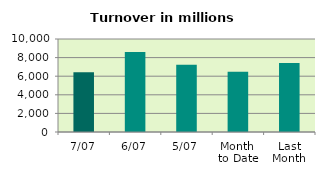
| Category | Series 0 |
|---|---|
| 7/07 | 6430.291 |
| 6/07 | 8599.253 |
| 5/07 | 7240.967 |
| Month 
to Date | 6479.562 |
| Last
Month | 7424.465 |